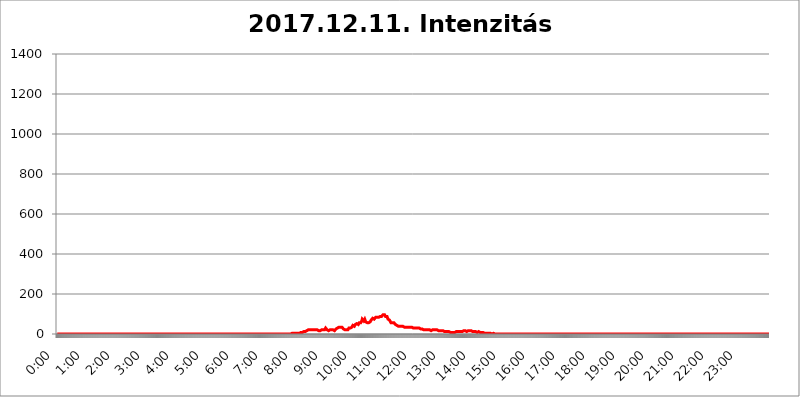
| Category | 2017.12.11. Intenzitás [W/m^2] |
|---|---|
| 0.0 | 0 |
| 0.0006944444444444445 | 0 |
| 0.001388888888888889 | 0 |
| 0.0020833333333333333 | 0 |
| 0.002777777777777778 | 0 |
| 0.003472222222222222 | 0 |
| 0.004166666666666667 | 0 |
| 0.004861111111111111 | 0 |
| 0.005555555555555556 | 0 |
| 0.0062499999999999995 | 0 |
| 0.006944444444444444 | 0 |
| 0.007638888888888889 | 0 |
| 0.008333333333333333 | 0 |
| 0.009027777777777779 | 0 |
| 0.009722222222222222 | 0 |
| 0.010416666666666666 | 0 |
| 0.011111111111111112 | 0 |
| 0.011805555555555555 | 0 |
| 0.012499999999999999 | 0 |
| 0.013194444444444444 | 0 |
| 0.013888888888888888 | 0 |
| 0.014583333333333332 | 0 |
| 0.015277777777777777 | 0 |
| 0.015972222222222224 | 0 |
| 0.016666666666666666 | 0 |
| 0.017361111111111112 | 0 |
| 0.018055555555555557 | 0 |
| 0.01875 | 0 |
| 0.019444444444444445 | 0 |
| 0.02013888888888889 | 0 |
| 0.020833333333333332 | 0 |
| 0.02152777777777778 | 0 |
| 0.022222222222222223 | 0 |
| 0.02291666666666667 | 0 |
| 0.02361111111111111 | 0 |
| 0.024305555555555556 | 0 |
| 0.024999999999999998 | 0 |
| 0.025694444444444447 | 0 |
| 0.02638888888888889 | 0 |
| 0.027083333333333334 | 0 |
| 0.027777777777777776 | 0 |
| 0.02847222222222222 | 0 |
| 0.029166666666666664 | 0 |
| 0.029861111111111113 | 0 |
| 0.030555555555555555 | 0 |
| 0.03125 | 0 |
| 0.03194444444444445 | 0 |
| 0.03263888888888889 | 0 |
| 0.03333333333333333 | 0 |
| 0.034027777777777775 | 0 |
| 0.034722222222222224 | 0 |
| 0.035416666666666666 | 0 |
| 0.036111111111111115 | 0 |
| 0.03680555555555556 | 0 |
| 0.0375 | 0 |
| 0.03819444444444444 | 0 |
| 0.03888888888888889 | 0 |
| 0.03958333333333333 | 0 |
| 0.04027777777777778 | 0 |
| 0.04097222222222222 | 0 |
| 0.041666666666666664 | 0 |
| 0.042361111111111106 | 0 |
| 0.04305555555555556 | 0 |
| 0.043750000000000004 | 0 |
| 0.044444444444444446 | 0 |
| 0.04513888888888889 | 0 |
| 0.04583333333333334 | 0 |
| 0.04652777777777778 | 0 |
| 0.04722222222222222 | 0 |
| 0.04791666666666666 | 0 |
| 0.04861111111111111 | 0 |
| 0.049305555555555554 | 0 |
| 0.049999999999999996 | 0 |
| 0.05069444444444445 | 0 |
| 0.051388888888888894 | 0 |
| 0.052083333333333336 | 0 |
| 0.05277777777777778 | 0 |
| 0.05347222222222222 | 0 |
| 0.05416666666666667 | 0 |
| 0.05486111111111111 | 0 |
| 0.05555555555555555 | 0 |
| 0.05625 | 0 |
| 0.05694444444444444 | 0 |
| 0.057638888888888885 | 0 |
| 0.05833333333333333 | 0 |
| 0.05902777777777778 | 0 |
| 0.059722222222222225 | 0 |
| 0.06041666666666667 | 0 |
| 0.061111111111111116 | 0 |
| 0.06180555555555556 | 0 |
| 0.0625 | 0 |
| 0.06319444444444444 | 0 |
| 0.06388888888888888 | 0 |
| 0.06458333333333334 | 0 |
| 0.06527777777777778 | 0 |
| 0.06597222222222222 | 0 |
| 0.06666666666666667 | 0 |
| 0.06736111111111111 | 0 |
| 0.06805555555555555 | 0 |
| 0.06874999999999999 | 0 |
| 0.06944444444444443 | 0 |
| 0.07013888888888889 | 0 |
| 0.07083333333333333 | 0 |
| 0.07152777777777779 | 0 |
| 0.07222222222222223 | 0 |
| 0.07291666666666667 | 0 |
| 0.07361111111111111 | 0 |
| 0.07430555555555556 | 0 |
| 0.075 | 0 |
| 0.07569444444444444 | 0 |
| 0.0763888888888889 | 0 |
| 0.07708333333333334 | 0 |
| 0.07777777777777778 | 0 |
| 0.07847222222222222 | 0 |
| 0.07916666666666666 | 0 |
| 0.0798611111111111 | 0 |
| 0.08055555555555556 | 0 |
| 0.08125 | 0 |
| 0.08194444444444444 | 0 |
| 0.08263888888888889 | 0 |
| 0.08333333333333333 | 0 |
| 0.08402777777777777 | 0 |
| 0.08472222222222221 | 0 |
| 0.08541666666666665 | 0 |
| 0.08611111111111112 | 0 |
| 0.08680555555555557 | 0 |
| 0.08750000000000001 | 0 |
| 0.08819444444444445 | 0 |
| 0.08888888888888889 | 0 |
| 0.08958333333333333 | 0 |
| 0.09027777777777778 | 0 |
| 0.09097222222222222 | 0 |
| 0.09166666666666667 | 0 |
| 0.09236111111111112 | 0 |
| 0.09305555555555556 | 0 |
| 0.09375 | 0 |
| 0.09444444444444444 | 0 |
| 0.09513888888888888 | 0 |
| 0.09583333333333333 | 0 |
| 0.09652777777777777 | 0 |
| 0.09722222222222222 | 0 |
| 0.09791666666666667 | 0 |
| 0.09861111111111111 | 0 |
| 0.09930555555555555 | 0 |
| 0.09999999999999999 | 0 |
| 0.10069444444444443 | 0 |
| 0.1013888888888889 | 0 |
| 0.10208333333333335 | 0 |
| 0.10277777777777779 | 0 |
| 0.10347222222222223 | 0 |
| 0.10416666666666667 | 0 |
| 0.10486111111111111 | 0 |
| 0.10555555555555556 | 0 |
| 0.10625 | 0 |
| 0.10694444444444444 | 0 |
| 0.1076388888888889 | 0 |
| 0.10833333333333334 | 0 |
| 0.10902777777777778 | 0 |
| 0.10972222222222222 | 0 |
| 0.1111111111111111 | 0 |
| 0.11180555555555556 | 0 |
| 0.11180555555555556 | 0 |
| 0.1125 | 0 |
| 0.11319444444444444 | 0 |
| 0.11388888888888889 | 0 |
| 0.11458333333333333 | 0 |
| 0.11527777777777777 | 0 |
| 0.11597222222222221 | 0 |
| 0.11666666666666665 | 0 |
| 0.1173611111111111 | 0 |
| 0.11805555555555557 | 0 |
| 0.11944444444444445 | 0 |
| 0.12013888888888889 | 0 |
| 0.12083333333333333 | 0 |
| 0.12152777777777778 | 0 |
| 0.12222222222222223 | 0 |
| 0.12291666666666667 | 0 |
| 0.12291666666666667 | 0 |
| 0.12361111111111112 | 0 |
| 0.12430555555555556 | 0 |
| 0.125 | 0 |
| 0.12569444444444444 | 0 |
| 0.12638888888888888 | 0 |
| 0.12708333333333333 | 0 |
| 0.16875 | 0 |
| 0.12847222222222224 | 0 |
| 0.12916666666666668 | 0 |
| 0.12986111111111112 | 0 |
| 0.13055555555555556 | 0 |
| 0.13125 | 0 |
| 0.13194444444444445 | 0 |
| 0.1326388888888889 | 0 |
| 0.13333333333333333 | 0 |
| 0.13402777777777777 | 0 |
| 0.13402777777777777 | 0 |
| 0.13472222222222222 | 0 |
| 0.13541666666666666 | 0 |
| 0.1361111111111111 | 0 |
| 0.13749999999999998 | 0 |
| 0.13819444444444443 | 0 |
| 0.1388888888888889 | 0 |
| 0.13958333333333334 | 0 |
| 0.14027777777777778 | 0 |
| 0.14097222222222222 | 0 |
| 0.14166666666666666 | 0 |
| 0.1423611111111111 | 0 |
| 0.14305555555555557 | 0 |
| 0.14375000000000002 | 0 |
| 0.14444444444444446 | 0 |
| 0.1451388888888889 | 0 |
| 0.1451388888888889 | 0 |
| 0.14652777777777778 | 0 |
| 0.14722222222222223 | 0 |
| 0.14791666666666667 | 0 |
| 0.1486111111111111 | 0 |
| 0.14930555555555555 | 0 |
| 0.15 | 0 |
| 0.15069444444444444 | 0 |
| 0.15138888888888888 | 0 |
| 0.15208333333333332 | 0 |
| 0.15277777777777776 | 0 |
| 0.15347222222222223 | 0 |
| 0.15416666666666667 | 0 |
| 0.15486111111111112 | 0 |
| 0.15555555555555556 | 0 |
| 0.15625 | 0 |
| 0.15694444444444444 | 0 |
| 0.15763888888888888 | 0 |
| 0.15833333333333333 | 0 |
| 0.15902777777777777 | 0 |
| 0.15972222222222224 | 0 |
| 0.16041666666666668 | 0 |
| 0.16111111111111112 | 0 |
| 0.16180555555555556 | 0 |
| 0.1625 | 0 |
| 0.16319444444444445 | 0 |
| 0.1638888888888889 | 0 |
| 0.16458333333333333 | 0 |
| 0.16527777777777777 | 0 |
| 0.16597222222222222 | 0 |
| 0.16666666666666666 | 0 |
| 0.1673611111111111 | 0 |
| 0.16805555555555554 | 0 |
| 0.16874999999999998 | 0 |
| 0.16944444444444443 | 0 |
| 0.17013888888888887 | 0 |
| 0.1708333333333333 | 0 |
| 0.17152777777777775 | 0 |
| 0.17222222222222225 | 0 |
| 0.1729166666666667 | 0 |
| 0.17361111111111113 | 0 |
| 0.17430555555555557 | 0 |
| 0.17500000000000002 | 0 |
| 0.17569444444444446 | 0 |
| 0.1763888888888889 | 0 |
| 0.17708333333333334 | 0 |
| 0.17777777777777778 | 0 |
| 0.17847222222222223 | 0 |
| 0.17916666666666667 | 0 |
| 0.1798611111111111 | 0 |
| 0.18055555555555555 | 0 |
| 0.18125 | 0 |
| 0.18194444444444444 | 0 |
| 0.1826388888888889 | 0 |
| 0.18333333333333335 | 0 |
| 0.1840277777777778 | 0 |
| 0.18472222222222223 | 0 |
| 0.18541666666666667 | 0 |
| 0.18611111111111112 | 0 |
| 0.18680555555555556 | 0 |
| 0.1875 | 0 |
| 0.18819444444444444 | 0 |
| 0.18888888888888888 | 0 |
| 0.18958333333333333 | 0 |
| 0.19027777777777777 | 0 |
| 0.1909722222222222 | 0 |
| 0.19166666666666665 | 0 |
| 0.19236111111111112 | 0 |
| 0.19305555555555554 | 0 |
| 0.19375 | 0 |
| 0.19444444444444445 | 0 |
| 0.1951388888888889 | 0 |
| 0.19583333333333333 | 0 |
| 0.19652777777777777 | 0 |
| 0.19722222222222222 | 0 |
| 0.19791666666666666 | 0 |
| 0.1986111111111111 | 0 |
| 0.19930555555555554 | 0 |
| 0.19999999999999998 | 0 |
| 0.20069444444444443 | 0 |
| 0.20138888888888887 | 0 |
| 0.2020833333333333 | 0 |
| 0.2027777777777778 | 0 |
| 0.2034722222222222 | 0 |
| 0.2041666666666667 | 0 |
| 0.20486111111111113 | 0 |
| 0.20555555555555557 | 0 |
| 0.20625000000000002 | 0 |
| 0.20694444444444446 | 0 |
| 0.2076388888888889 | 0 |
| 0.20833333333333334 | 0 |
| 0.20902777777777778 | 0 |
| 0.20972222222222223 | 0 |
| 0.21041666666666667 | 0 |
| 0.2111111111111111 | 0 |
| 0.21180555555555555 | 0 |
| 0.2125 | 0 |
| 0.21319444444444444 | 0 |
| 0.2138888888888889 | 0 |
| 0.21458333333333335 | 0 |
| 0.2152777777777778 | 0 |
| 0.21597222222222223 | 0 |
| 0.21666666666666667 | 0 |
| 0.21736111111111112 | 0 |
| 0.21805555555555556 | 0 |
| 0.21875 | 0 |
| 0.21944444444444444 | 0 |
| 0.22013888888888888 | 0 |
| 0.22083333333333333 | 0 |
| 0.22152777777777777 | 0 |
| 0.2222222222222222 | 0 |
| 0.22291666666666665 | 0 |
| 0.2236111111111111 | 0 |
| 0.22430555555555556 | 0 |
| 0.225 | 0 |
| 0.22569444444444445 | 0 |
| 0.2263888888888889 | 0 |
| 0.22708333333333333 | 0 |
| 0.22777777777777777 | 0 |
| 0.22847222222222222 | 0 |
| 0.22916666666666666 | 0 |
| 0.2298611111111111 | 0 |
| 0.23055555555555554 | 0 |
| 0.23124999999999998 | 0 |
| 0.23194444444444443 | 0 |
| 0.23263888888888887 | 0 |
| 0.2333333333333333 | 0 |
| 0.2340277777777778 | 0 |
| 0.2347222222222222 | 0 |
| 0.2354166666666667 | 0 |
| 0.23611111111111113 | 0 |
| 0.23680555555555557 | 0 |
| 0.23750000000000002 | 0 |
| 0.23819444444444446 | 0 |
| 0.2388888888888889 | 0 |
| 0.23958333333333334 | 0 |
| 0.24027777777777778 | 0 |
| 0.24097222222222223 | 0 |
| 0.24166666666666667 | 0 |
| 0.2423611111111111 | 0 |
| 0.24305555555555555 | 0 |
| 0.24375 | 0 |
| 0.24444444444444446 | 0 |
| 0.24513888888888888 | 0 |
| 0.24583333333333335 | 0 |
| 0.2465277777777778 | 0 |
| 0.24722222222222223 | 0 |
| 0.24791666666666667 | 0 |
| 0.24861111111111112 | 0 |
| 0.24930555555555556 | 0 |
| 0.25 | 0 |
| 0.25069444444444444 | 0 |
| 0.2513888888888889 | 0 |
| 0.2520833333333333 | 0 |
| 0.25277777777777777 | 0 |
| 0.2534722222222222 | 0 |
| 0.25416666666666665 | 0 |
| 0.2548611111111111 | 0 |
| 0.2555555555555556 | 0 |
| 0.25625000000000003 | 0 |
| 0.2569444444444445 | 0 |
| 0.2576388888888889 | 0 |
| 0.25833333333333336 | 0 |
| 0.2590277777777778 | 0 |
| 0.25972222222222224 | 0 |
| 0.2604166666666667 | 0 |
| 0.2611111111111111 | 0 |
| 0.26180555555555557 | 0 |
| 0.2625 | 0 |
| 0.26319444444444445 | 0 |
| 0.2638888888888889 | 0 |
| 0.26458333333333334 | 0 |
| 0.2652777777777778 | 0 |
| 0.2659722222222222 | 0 |
| 0.26666666666666666 | 0 |
| 0.2673611111111111 | 0 |
| 0.26805555555555555 | 0 |
| 0.26875 | 0 |
| 0.26944444444444443 | 0 |
| 0.2701388888888889 | 0 |
| 0.2708333333333333 | 0 |
| 0.27152777777777776 | 0 |
| 0.2722222222222222 | 0 |
| 0.27291666666666664 | 0 |
| 0.2736111111111111 | 0 |
| 0.2743055555555555 | 0 |
| 0.27499999999999997 | 0 |
| 0.27569444444444446 | 0 |
| 0.27638888888888885 | 0 |
| 0.27708333333333335 | 0 |
| 0.2777777777777778 | 0 |
| 0.27847222222222223 | 0 |
| 0.2791666666666667 | 0 |
| 0.2798611111111111 | 0 |
| 0.28055555555555556 | 0 |
| 0.28125 | 0 |
| 0.28194444444444444 | 0 |
| 0.2826388888888889 | 0 |
| 0.2833333333333333 | 0 |
| 0.28402777777777777 | 0 |
| 0.2847222222222222 | 0 |
| 0.28541666666666665 | 0 |
| 0.28611111111111115 | 0 |
| 0.28680555555555554 | 0 |
| 0.28750000000000003 | 0 |
| 0.2881944444444445 | 0 |
| 0.2888888888888889 | 0 |
| 0.28958333333333336 | 0 |
| 0.2902777777777778 | 0 |
| 0.29097222222222224 | 0 |
| 0.2916666666666667 | 0 |
| 0.2923611111111111 | 0 |
| 0.29305555555555557 | 0 |
| 0.29375 | 0 |
| 0.29444444444444445 | 0 |
| 0.2951388888888889 | 0 |
| 0.29583333333333334 | 0 |
| 0.2965277777777778 | 0 |
| 0.2972222222222222 | 0 |
| 0.29791666666666666 | 0 |
| 0.2986111111111111 | 0 |
| 0.29930555555555555 | 0 |
| 0.3 | 0 |
| 0.30069444444444443 | 0 |
| 0.3013888888888889 | 0 |
| 0.3020833333333333 | 0 |
| 0.30277777777777776 | 0 |
| 0.3034722222222222 | 0 |
| 0.30416666666666664 | 0 |
| 0.3048611111111111 | 0 |
| 0.3055555555555555 | 0 |
| 0.30624999999999997 | 0 |
| 0.3069444444444444 | 0 |
| 0.3076388888888889 | 0 |
| 0.30833333333333335 | 0 |
| 0.3090277777777778 | 0 |
| 0.30972222222222223 | 0 |
| 0.3104166666666667 | 0 |
| 0.3111111111111111 | 0 |
| 0.31180555555555556 | 0 |
| 0.3125 | 0 |
| 0.31319444444444444 | 0 |
| 0.3138888888888889 | 0 |
| 0.3145833333333333 | 0 |
| 0.31527777777777777 | 0 |
| 0.3159722222222222 | 0 |
| 0.31666666666666665 | 0 |
| 0.31736111111111115 | 0 |
| 0.31805555555555554 | 0 |
| 0.31875000000000003 | 0 |
| 0.3194444444444445 | 0 |
| 0.3201388888888889 | 0 |
| 0.32083333333333336 | 0 |
| 0.3215277777777778 | 0 |
| 0.32222222222222224 | 0 |
| 0.3229166666666667 | 0 |
| 0.3236111111111111 | 0 |
| 0.32430555555555557 | 0 |
| 0.325 | 0 |
| 0.32569444444444445 | 3.525 |
| 0.3263888888888889 | 3.525 |
| 0.32708333333333334 | 0 |
| 0.3277777777777778 | 0 |
| 0.3284722222222222 | 3.525 |
| 0.32916666666666666 | 3.525 |
| 0.3298611111111111 | 3.525 |
| 0.33055555555555555 | 3.525 |
| 0.33125 | 3.525 |
| 0.33194444444444443 | 3.525 |
| 0.3326388888888889 | 3.525 |
| 0.3333333333333333 | 3.525 |
| 0.3340277777777778 | 3.525 |
| 0.3347222222222222 | 3.525 |
| 0.3354166666666667 | 3.525 |
| 0.3361111111111111 | 3.525 |
| 0.3368055555555556 | 3.525 |
| 0.33749999999999997 | 3.525 |
| 0.33819444444444446 | 3.525 |
| 0.33888888888888885 | 3.525 |
| 0.33958333333333335 | 3.525 |
| 0.34027777777777773 | 7.887 |
| 0.34097222222222223 | 7.887 |
| 0.3416666666666666 | 7.887 |
| 0.3423611111111111 | 7.887 |
| 0.3430555555555555 | 7.887 |
| 0.34375 | 7.887 |
| 0.3444444444444445 | 7.887 |
| 0.3451388888888889 | 7.887 |
| 0.3458333333333334 | 12.257 |
| 0.34652777777777777 | 12.257 |
| 0.34722222222222227 | 12.257 |
| 0.34791666666666665 | 12.257 |
| 0.34861111111111115 | 12.257 |
| 0.34930555555555554 | 12.257 |
| 0.35000000000000003 | 16.636 |
| 0.3506944444444444 | 16.636 |
| 0.3513888888888889 | 21.024 |
| 0.3520833333333333 | 21.024 |
| 0.3527777777777778 | 21.024 |
| 0.3534722222222222 | 21.024 |
| 0.3541666666666667 | 21.024 |
| 0.3548611111111111 | 21.024 |
| 0.35555555555555557 | 21.024 |
| 0.35625 | 21.024 |
| 0.35694444444444445 | 21.024 |
| 0.3576388888888889 | 25.419 |
| 0.35833333333333334 | 21.024 |
| 0.3590277777777778 | 21.024 |
| 0.3597222222222222 | 21.024 |
| 0.36041666666666666 | 21.024 |
| 0.3611111111111111 | 21.024 |
| 0.36180555555555555 | 21.024 |
| 0.3625 | 21.024 |
| 0.36319444444444443 | 21.024 |
| 0.3638888888888889 | 21.024 |
| 0.3645833333333333 | 21.024 |
| 0.3652777777777778 | 21.024 |
| 0.3659722222222222 | 16.636 |
| 0.3666666666666667 | 16.636 |
| 0.3673611111111111 | 21.024 |
| 0.3680555555555556 | 16.636 |
| 0.36874999999999997 | 16.636 |
| 0.36944444444444446 | 16.636 |
| 0.37013888888888885 | 21.024 |
| 0.37083333333333335 | 21.024 |
| 0.37152777777777773 | 21.024 |
| 0.37222222222222223 | 21.024 |
| 0.3729166666666666 | 21.024 |
| 0.3736111111111111 | 21.024 |
| 0.3743055555555555 | 21.024 |
| 0.375 | 21.024 |
| 0.3756944444444445 | 25.419 |
| 0.3763888888888889 | 29.823 |
| 0.3770833333333334 | 29.823 |
| 0.37777777777777777 | 25.419 |
| 0.37847222222222227 | 21.024 |
| 0.37916666666666665 | 21.024 |
| 0.37986111111111115 | 16.636 |
| 0.38055555555555554 | 16.636 |
| 0.38125000000000003 | 21.024 |
| 0.3819444444444444 | 21.024 |
| 0.3826388888888889 | 21.024 |
| 0.3833333333333333 | 21.024 |
| 0.3840277777777778 | 21.024 |
| 0.3847222222222222 | 21.024 |
| 0.3854166666666667 | 21.024 |
| 0.3861111111111111 | 21.024 |
| 0.38680555555555557 | 21.024 |
| 0.3875 | 25.419 |
| 0.38819444444444445 | 21.024 |
| 0.3888888888888889 | 16.636 |
| 0.38958333333333334 | 21.024 |
| 0.3902777777777778 | 21.024 |
| 0.3909722222222222 | 25.419 |
| 0.39166666666666666 | 25.419 |
| 0.3923611111111111 | 29.823 |
| 0.39305555555555555 | 29.823 |
| 0.39375 | 34.234 |
| 0.39444444444444443 | 34.234 |
| 0.3951388888888889 | 34.234 |
| 0.3958333333333333 | 38.653 |
| 0.3965277777777778 | 38.653 |
| 0.3972222222222222 | 34.234 |
| 0.3979166666666667 | 34.234 |
| 0.3986111111111111 | 34.234 |
| 0.3993055555555556 | 34.234 |
| 0.39999999999999997 | 29.823 |
| 0.40069444444444446 | 29.823 |
| 0.40138888888888885 | 25.419 |
| 0.40208333333333335 | 25.419 |
| 0.40277777777777773 | 21.024 |
| 0.40347222222222223 | 21.024 |
| 0.4041666666666666 | 21.024 |
| 0.4048611111111111 | 21.024 |
| 0.4055555555555555 | 21.024 |
| 0.40625 | 21.024 |
| 0.4069444444444445 | 21.024 |
| 0.4076388888888889 | 21.024 |
| 0.4083333333333334 | 25.419 |
| 0.40902777777777777 | 29.823 |
| 0.40972222222222227 | 29.823 |
| 0.41041666666666665 | 34.234 |
| 0.41111111111111115 | 29.823 |
| 0.41180555555555554 | 29.823 |
| 0.41250000000000003 | 29.823 |
| 0.4131944444444444 | 34.234 |
| 0.4138888888888889 | 38.653 |
| 0.4145833333333333 | 43.079 |
| 0.4152777777777778 | 38.653 |
| 0.4159722222222222 | 38.653 |
| 0.4166666666666667 | 38.653 |
| 0.4173611111111111 | 43.079 |
| 0.41805555555555557 | 47.511 |
| 0.41875 | 51.951 |
| 0.41944444444444445 | 51.951 |
| 0.4201388888888889 | 51.951 |
| 0.42083333333333334 | 47.511 |
| 0.4215277777777778 | 47.511 |
| 0.4222222222222222 | 47.511 |
| 0.42291666666666666 | 51.951 |
| 0.4236111111111111 | 56.398 |
| 0.42430555555555555 | 56.398 |
| 0.425 | 56.398 |
| 0.42569444444444443 | 56.398 |
| 0.4263888888888889 | 60.85 |
| 0.4270833333333333 | 65.31 |
| 0.4277777777777778 | 74.246 |
| 0.4284722222222222 | 74.246 |
| 0.4291666666666667 | 69.775 |
| 0.4298611111111111 | 65.31 |
| 0.4305555555555556 | 69.775 |
| 0.43124999999999997 | 74.246 |
| 0.43194444444444446 | 69.775 |
| 0.43263888888888885 | 60.85 |
| 0.43333333333333335 | 56.398 |
| 0.43402777777777773 | 56.398 |
| 0.43472222222222223 | 56.398 |
| 0.4354166666666666 | 51.951 |
| 0.4361111111111111 | 51.951 |
| 0.4368055555555555 | 56.398 |
| 0.4375 | 56.398 |
| 0.4381944444444445 | 56.398 |
| 0.4388888888888889 | 60.85 |
| 0.4395833333333334 | 65.31 |
| 0.44027777777777777 | 69.775 |
| 0.44097222222222227 | 74.246 |
| 0.44166666666666665 | 74.246 |
| 0.44236111111111115 | 78.722 |
| 0.44305555555555554 | 74.246 |
| 0.44375000000000003 | 74.246 |
| 0.4444444444444444 | 74.246 |
| 0.4451388888888889 | 74.246 |
| 0.4458333333333333 | 78.722 |
| 0.4465277777777778 | 83.205 |
| 0.4472222222222222 | 83.205 |
| 0.4479166666666667 | 83.205 |
| 0.4486111111111111 | 83.205 |
| 0.44930555555555557 | 83.205 |
| 0.45 | 83.205 |
| 0.45069444444444445 | 83.205 |
| 0.4513888888888889 | 87.692 |
| 0.45208333333333334 | 83.205 |
| 0.4527777777777778 | 87.692 |
| 0.4534722222222222 | 92.184 |
| 0.45416666666666666 | 92.184 |
| 0.4548611111111111 | 87.692 |
| 0.45555555555555555 | 92.184 |
| 0.45625 | 92.184 |
| 0.45694444444444443 | 96.682 |
| 0.4576388888888889 | 96.682 |
| 0.4583333333333333 | 96.682 |
| 0.4590277777777778 | 96.682 |
| 0.4597222222222222 | 96.682 |
| 0.4604166666666667 | 87.692 |
| 0.4611111111111111 | 83.205 |
| 0.4618055555555556 | 83.205 |
| 0.46249999999999997 | 87.692 |
| 0.46319444444444446 | 87.692 |
| 0.46388888888888885 | 74.246 |
| 0.46458333333333335 | 69.775 |
| 0.46527777777777773 | 74.246 |
| 0.46597222222222223 | 69.775 |
| 0.4666666666666666 | 65.31 |
| 0.4673611111111111 | 65.31 |
| 0.4680555555555555 | 56.398 |
| 0.46875 | 56.398 |
| 0.4694444444444445 | 56.398 |
| 0.4701388888888889 | 56.398 |
| 0.4708333333333334 | 56.398 |
| 0.47152777777777777 | 56.398 |
| 0.47222222222222227 | 56.398 |
| 0.47291666666666665 | 56.398 |
| 0.47361111111111115 | 51.951 |
| 0.47430555555555554 | 47.511 |
| 0.47500000000000003 | 47.511 |
| 0.4756944444444444 | 47.511 |
| 0.4763888888888889 | 43.079 |
| 0.4770833333333333 | 38.653 |
| 0.4777777777777778 | 38.653 |
| 0.4784722222222222 | 38.653 |
| 0.4791666666666667 | 38.653 |
| 0.4798611111111111 | 38.653 |
| 0.48055555555555557 | 38.653 |
| 0.48125 | 38.653 |
| 0.48194444444444445 | 38.653 |
| 0.4826388888888889 | 38.653 |
| 0.48333333333333334 | 38.653 |
| 0.4840277777777778 | 38.653 |
| 0.4847222222222222 | 38.653 |
| 0.48541666666666666 | 34.234 |
| 0.4861111111111111 | 34.234 |
| 0.48680555555555555 | 34.234 |
| 0.4875 | 34.234 |
| 0.48819444444444443 | 34.234 |
| 0.4888888888888889 | 34.234 |
| 0.4895833333333333 | 34.234 |
| 0.4902777777777778 | 34.234 |
| 0.4909722222222222 | 34.234 |
| 0.4916666666666667 | 34.234 |
| 0.4923611111111111 | 34.234 |
| 0.4930555555555556 | 34.234 |
| 0.49374999999999997 | 34.234 |
| 0.49444444444444446 | 34.234 |
| 0.49513888888888885 | 34.234 |
| 0.49583333333333335 | 34.234 |
| 0.49652777777777773 | 34.234 |
| 0.49722222222222223 | 34.234 |
| 0.4979166666666666 | 34.234 |
| 0.4986111111111111 | 29.823 |
| 0.4993055555555555 | 29.823 |
| 0.5 | 29.823 |
| 0.5006944444444444 | 29.823 |
| 0.5013888888888889 | 29.823 |
| 0.5020833333333333 | 29.823 |
| 0.5027777777777778 | 29.823 |
| 0.5034722222222222 | 29.823 |
| 0.5041666666666667 | 29.823 |
| 0.5048611111111111 | 29.823 |
| 0.5055555555555555 | 29.823 |
| 0.50625 | 25.419 |
| 0.5069444444444444 | 29.823 |
| 0.5076388888888889 | 29.823 |
| 0.5083333333333333 | 25.419 |
| 0.5090277777777777 | 29.823 |
| 0.5097222222222222 | 25.419 |
| 0.5104166666666666 | 25.419 |
| 0.5111111111111112 | 25.419 |
| 0.5118055555555555 | 25.419 |
| 0.5125000000000001 | 25.419 |
| 0.5131944444444444 | 25.419 |
| 0.513888888888889 | 21.024 |
| 0.5145833333333333 | 25.419 |
| 0.5152777777777778 | 21.024 |
| 0.5159722222222222 | 21.024 |
| 0.5166666666666667 | 21.024 |
| 0.517361111111111 | 21.024 |
| 0.5180555555555556 | 21.024 |
| 0.5187499999999999 | 21.024 |
| 0.5194444444444445 | 21.024 |
| 0.5201388888888888 | 21.024 |
| 0.5208333333333334 | 21.024 |
| 0.5215277777777778 | 21.024 |
| 0.5222222222222223 | 21.024 |
| 0.5229166666666667 | 21.024 |
| 0.5236111111111111 | 21.024 |
| 0.5243055555555556 | 16.636 |
| 0.525 | 16.636 |
| 0.5256944444444445 | 16.636 |
| 0.5263888888888889 | 21.024 |
| 0.5270833333333333 | 21.024 |
| 0.5277777777777778 | 21.024 |
| 0.5284722222222222 | 21.024 |
| 0.5291666666666667 | 21.024 |
| 0.5298611111111111 | 21.024 |
| 0.5305555555555556 | 21.024 |
| 0.53125 | 21.024 |
| 0.5319444444444444 | 21.024 |
| 0.5326388888888889 | 21.024 |
| 0.5333333333333333 | 21.024 |
| 0.5340277777777778 | 21.024 |
| 0.5347222222222222 | 16.636 |
| 0.5354166666666667 | 16.636 |
| 0.5361111111111111 | 16.636 |
| 0.5368055555555555 | 16.636 |
| 0.5375 | 16.636 |
| 0.5381944444444444 | 16.636 |
| 0.5388888888888889 | 16.636 |
| 0.5395833333333333 | 16.636 |
| 0.5402777777777777 | 16.636 |
| 0.5409722222222222 | 16.636 |
| 0.5416666666666666 | 16.636 |
| 0.5423611111111112 | 16.636 |
| 0.5430555555555555 | 12.257 |
| 0.5437500000000001 | 12.257 |
| 0.5444444444444444 | 12.257 |
| 0.545138888888889 | 12.257 |
| 0.5458333333333333 | 12.257 |
| 0.5465277777777778 | 12.257 |
| 0.5472222222222222 | 12.257 |
| 0.5479166666666667 | 12.257 |
| 0.548611111111111 | 12.257 |
| 0.5493055555555556 | 12.257 |
| 0.5499999999999999 | 12.257 |
| 0.5506944444444445 | 7.887 |
| 0.5513888888888888 | 7.887 |
| 0.5520833333333334 | 7.887 |
| 0.5527777777777778 | 7.887 |
| 0.5534722222222223 | 7.887 |
| 0.5541666666666667 | 7.887 |
| 0.5548611111111111 | 7.887 |
| 0.5555555555555556 | 7.887 |
| 0.55625 | 7.887 |
| 0.5569444444444445 | 7.887 |
| 0.5576388888888889 | 7.887 |
| 0.5583333333333333 | 7.887 |
| 0.5590277777777778 | 12.257 |
| 0.5597222222222222 | 12.257 |
| 0.5604166666666667 | 12.257 |
| 0.5611111111111111 | 12.257 |
| 0.5618055555555556 | 12.257 |
| 0.5625 | 12.257 |
| 0.5631944444444444 | 12.257 |
| 0.5638888888888889 | 12.257 |
| 0.5645833333333333 | 12.257 |
| 0.5652777777777778 | 12.257 |
| 0.5659722222222222 | 12.257 |
| 0.5666666666666667 | 12.257 |
| 0.5673611111111111 | 12.257 |
| 0.5680555555555555 | 12.257 |
| 0.56875 | 16.636 |
| 0.5694444444444444 | 16.636 |
| 0.5701388888888889 | 16.636 |
| 0.5708333333333333 | 16.636 |
| 0.5715277777777777 | 12.257 |
| 0.5722222222222222 | 16.636 |
| 0.5729166666666666 | 16.636 |
| 0.5736111111111112 | 12.257 |
| 0.5743055555555555 | 12.257 |
| 0.5750000000000001 | 16.636 |
| 0.5756944444444444 | 16.636 |
| 0.576388888888889 | 16.636 |
| 0.5770833333333333 | 16.636 |
| 0.5777777777777778 | 16.636 |
| 0.5784722222222222 | 16.636 |
| 0.5791666666666667 | 16.636 |
| 0.579861111111111 | 16.636 |
| 0.5805555555555556 | 16.636 |
| 0.5812499999999999 | 12.257 |
| 0.5819444444444445 | 12.257 |
| 0.5826388888888888 | 12.257 |
| 0.5833333333333334 | 12.257 |
| 0.5840277777777778 | 12.257 |
| 0.5847222222222223 | 12.257 |
| 0.5854166666666667 | 12.257 |
| 0.5861111111111111 | 12.257 |
| 0.5868055555555556 | 12.257 |
| 0.5875 | 7.887 |
| 0.5881944444444445 | 12.257 |
| 0.5888888888888889 | 7.887 |
| 0.5895833333333333 | 7.887 |
| 0.5902777777777778 | 7.887 |
| 0.5909722222222222 | 12.257 |
| 0.5916666666666667 | 7.887 |
| 0.5923611111111111 | 7.887 |
| 0.5930555555555556 | 7.887 |
| 0.59375 | 7.887 |
| 0.5944444444444444 | 7.887 |
| 0.5951388888888889 | 7.887 |
| 0.5958333333333333 | 7.887 |
| 0.5965277777777778 | 7.887 |
| 0.5972222222222222 | 7.887 |
| 0.5979166666666667 | 7.887 |
| 0.5986111111111111 | 7.887 |
| 0.5993055555555555 | 3.525 |
| 0.6 | 3.525 |
| 0.6006944444444444 | 3.525 |
| 0.6013888888888889 | 3.525 |
| 0.6020833333333333 | 3.525 |
| 0.6027777777777777 | 3.525 |
| 0.6034722222222222 | 3.525 |
| 0.6041666666666666 | 3.525 |
| 0.6048611111111112 | 3.525 |
| 0.6055555555555555 | 3.525 |
| 0.6062500000000001 | 3.525 |
| 0.6069444444444444 | 3.525 |
| 0.607638888888889 | 3.525 |
| 0.6083333333333333 | 3.525 |
| 0.6090277777777778 | 3.525 |
| 0.6097222222222222 | 0 |
| 0.6104166666666667 | 0 |
| 0.611111111111111 | 3.525 |
| 0.6118055555555556 | 3.525 |
| 0.6124999999999999 | 0 |
| 0.6131944444444445 | 0 |
| 0.6138888888888888 | 0 |
| 0.6145833333333334 | 3.525 |
| 0.6152777777777778 | 0 |
| 0.6159722222222223 | 0 |
| 0.6166666666666667 | 0 |
| 0.6173611111111111 | 0 |
| 0.6180555555555556 | 0 |
| 0.61875 | 0 |
| 0.6194444444444445 | 0 |
| 0.6201388888888889 | 0 |
| 0.6208333333333333 | 0 |
| 0.6215277777777778 | 0 |
| 0.6222222222222222 | 0 |
| 0.6229166666666667 | 0 |
| 0.6236111111111111 | 0 |
| 0.6243055555555556 | 0 |
| 0.625 | 0 |
| 0.6256944444444444 | 0 |
| 0.6263888888888889 | 0 |
| 0.6270833333333333 | 0 |
| 0.6277777777777778 | 0 |
| 0.6284722222222222 | 0 |
| 0.6291666666666667 | 0 |
| 0.6298611111111111 | 0 |
| 0.6305555555555555 | 0 |
| 0.63125 | 0 |
| 0.6319444444444444 | 0 |
| 0.6326388888888889 | 0 |
| 0.6333333333333333 | 0 |
| 0.6340277777777777 | 0 |
| 0.6347222222222222 | 0 |
| 0.6354166666666666 | 0 |
| 0.6361111111111112 | 0 |
| 0.6368055555555555 | 0 |
| 0.6375000000000001 | 0 |
| 0.6381944444444444 | 0 |
| 0.638888888888889 | 0 |
| 0.6395833333333333 | 0 |
| 0.6402777777777778 | 0 |
| 0.6409722222222222 | 0 |
| 0.6416666666666667 | 0 |
| 0.642361111111111 | 0 |
| 0.6430555555555556 | 0 |
| 0.6437499999999999 | 0 |
| 0.6444444444444445 | 0 |
| 0.6451388888888888 | 0 |
| 0.6458333333333334 | 0 |
| 0.6465277777777778 | 0 |
| 0.6472222222222223 | 0 |
| 0.6479166666666667 | 0 |
| 0.6486111111111111 | 0 |
| 0.6493055555555556 | 0 |
| 0.65 | 0 |
| 0.6506944444444445 | 0 |
| 0.6513888888888889 | 0 |
| 0.6520833333333333 | 0 |
| 0.6527777777777778 | 0 |
| 0.6534722222222222 | 0 |
| 0.6541666666666667 | 0 |
| 0.6548611111111111 | 0 |
| 0.6555555555555556 | 0 |
| 0.65625 | 0 |
| 0.6569444444444444 | 0 |
| 0.6576388888888889 | 0 |
| 0.6583333333333333 | 0 |
| 0.6590277777777778 | 0 |
| 0.6597222222222222 | 0 |
| 0.6604166666666667 | 0 |
| 0.6611111111111111 | 0 |
| 0.6618055555555555 | 0 |
| 0.6625 | 0 |
| 0.6631944444444444 | 0 |
| 0.6638888888888889 | 0 |
| 0.6645833333333333 | 0 |
| 0.6652777777777777 | 0 |
| 0.6659722222222222 | 0 |
| 0.6666666666666666 | 0 |
| 0.6673611111111111 | 0 |
| 0.6680555555555556 | 0 |
| 0.6687500000000001 | 0 |
| 0.6694444444444444 | 0 |
| 0.6701388888888888 | 0 |
| 0.6708333333333334 | 0 |
| 0.6715277777777778 | 0 |
| 0.6722222222222222 | 0 |
| 0.6729166666666666 | 0 |
| 0.6736111111111112 | 0 |
| 0.6743055555555556 | 0 |
| 0.6749999999999999 | 0 |
| 0.6756944444444444 | 0 |
| 0.6763888888888889 | 0 |
| 0.6770833333333334 | 0 |
| 0.6777777777777777 | 0 |
| 0.6784722222222223 | 0 |
| 0.6791666666666667 | 0 |
| 0.6798611111111111 | 0 |
| 0.6805555555555555 | 0 |
| 0.68125 | 0 |
| 0.6819444444444445 | 0 |
| 0.6826388888888889 | 0 |
| 0.6833333333333332 | 0 |
| 0.6840277777777778 | 0 |
| 0.6847222222222222 | 0 |
| 0.6854166666666667 | 0 |
| 0.686111111111111 | 0 |
| 0.6868055555555556 | 0 |
| 0.6875 | 0 |
| 0.6881944444444444 | 0 |
| 0.688888888888889 | 0 |
| 0.6895833333333333 | 0 |
| 0.6902777777777778 | 0 |
| 0.6909722222222222 | 0 |
| 0.6916666666666668 | 0 |
| 0.6923611111111111 | 0 |
| 0.6930555555555555 | 0 |
| 0.69375 | 0 |
| 0.6944444444444445 | 0 |
| 0.6951388888888889 | 0 |
| 0.6958333333333333 | 0 |
| 0.6965277777777777 | 0 |
| 0.6972222222222223 | 0 |
| 0.6979166666666666 | 0 |
| 0.6986111111111111 | 0 |
| 0.6993055555555556 | 0 |
| 0.7000000000000001 | 0 |
| 0.7006944444444444 | 0 |
| 0.7013888888888888 | 0 |
| 0.7020833333333334 | 0 |
| 0.7027777777777778 | 0 |
| 0.7034722222222222 | 0 |
| 0.7041666666666666 | 0 |
| 0.7048611111111112 | 0 |
| 0.7055555555555556 | 0 |
| 0.7062499999999999 | 0 |
| 0.7069444444444444 | 0 |
| 0.7076388888888889 | 0 |
| 0.7083333333333334 | 0 |
| 0.7090277777777777 | 0 |
| 0.7097222222222223 | 0 |
| 0.7104166666666667 | 0 |
| 0.7111111111111111 | 0 |
| 0.7118055555555555 | 0 |
| 0.7125 | 0 |
| 0.7131944444444445 | 0 |
| 0.7138888888888889 | 0 |
| 0.7145833333333332 | 0 |
| 0.7152777777777778 | 0 |
| 0.7159722222222222 | 0 |
| 0.7166666666666667 | 0 |
| 0.717361111111111 | 0 |
| 0.7180555555555556 | 0 |
| 0.71875 | 0 |
| 0.7194444444444444 | 0 |
| 0.720138888888889 | 0 |
| 0.7208333333333333 | 0 |
| 0.7215277777777778 | 0 |
| 0.7222222222222222 | 0 |
| 0.7229166666666668 | 0 |
| 0.7236111111111111 | 0 |
| 0.7243055555555555 | 0 |
| 0.725 | 0 |
| 0.7256944444444445 | 0 |
| 0.7263888888888889 | 0 |
| 0.7270833333333333 | 0 |
| 0.7277777777777777 | 0 |
| 0.7284722222222223 | 0 |
| 0.7291666666666666 | 0 |
| 0.7298611111111111 | 0 |
| 0.7305555555555556 | 0 |
| 0.7312500000000001 | 0 |
| 0.7319444444444444 | 0 |
| 0.7326388888888888 | 0 |
| 0.7333333333333334 | 0 |
| 0.7340277777777778 | 0 |
| 0.7347222222222222 | 0 |
| 0.7354166666666666 | 0 |
| 0.7361111111111112 | 0 |
| 0.7368055555555556 | 0 |
| 0.7374999999999999 | 0 |
| 0.7381944444444444 | 0 |
| 0.7388888888888889 | 0 |
| 0.7395833333333334 | 0 |
| 0.7402777777777777 | 0 |
| 0.7409722222222223 | 0 |
| 0.7416666666666667 | 0 |
| 0.7423611111111111 | 0 |
| 0.7430555555555555 | 0 |
| 0.74375 | 0 |
| 0.7444444444444445 | 0 |
| 0.7451388888888889 | 0 |
| 0.7458333333333332 | 0 |
| 0.7465277777777778 | 0 |
| 0.7472222222222222 | 0 |
| 0.7479166666666667 | 0 |
| 0.748611111111111 | 0 |
| 0.7493055555555556 | 0 |
| 0.75 | 0 |
| 0.7506944444444444 | 0 |
| 0.751388888888889 | 0 |
| 0.7520833333333333 | 0 |
| 0.7527777777777778 | 0 |
| 0.7534722222222222 | 0 |
| 0.7541666666666668 | 0 |
| 0.7548611111111111 | 0 |
| 0.7555555555555555 | 0 |
| 0.75625 | 0 |
| 0.7569444444444445 | 0 |
| 0.7576388888888889 | 0 |
| 0.7583333333333333 | 0 |
| 0.7590277777777777 | 0 |
| 0.7597222222222223 | 0 |
| 0.7604166666666666 | 0 |
| 0.7611111111111111 | 0 |
| 0.7618055555555556 | 0 |
| 0.7625000000000001 | 0 |
| 0.7631944444444444 | 0 |
| 0.7638888888888888 | 0 |
| 0.7645833333333334 | 0 |
| 0.7652777777777778 | 0 |
| 0.7659722222222222 | 0 |
| 0.7666666666666666 | 0 |
| 0.7673611111111112 | 0 |
| 0.7680555555555556 | 0 |
| 0.7687499999999999 | 0 |
| 0.7694444444444444 | 0 |
| 0.7701388888888889 | 0 |
| 0.7708333333333334 | 0 |
| 0.7715277777777777 | 0 |
| 0.7722222222222223 | 0 |
| 0.7729166666666667 | 0 |
| 0.7736111111111111 | 0 |
| 0.7743055555555555 | 0 |
| 0.775 | 0 |
| 0.7756944444444445 | 0 |
| 0.7763888888888889 | 0 |
| 0.7770833333333332 | 0 |
| 0.7777777777777778 | 0 |
| 0.7784722222222222 | 0 |
| 0.7791666666666667 | 0 |
| 0.779861111111111 | 0 |
| 0.7805555555555556 | 0 |
| 0.78125 | 0 |
| 0.7819444444444444 | 0 |
| 0.782638888888889 | 0 |
| 0.7833333333333333 | 0 |
| 0.7840277777777778 | 0 |
| 0.7847222222222222 | 0 |
| 0.7854166666666668 | 0 |
| 0.7861111111111111 | 0 |
| 0.7868055555555555 | 0 |
| 0.7875 | 0 |
| 0.7881944444444445 | 0 |
| 0.7888888888888889 | 0 |
| 0.7895833333333333 | 0 |
| 0.7902777777777777 | 0 |
| 0.7909722222222223 | 0 |
| 0.7916666666666666 | 0 |
| 0.7923611111111111 | 0 |
| 0.7930555555555556 | 0 |
| 0.7937500000000001 | 0 |
| 0.7944444444444444 | 0 |
| 0.7951388888888888 | 0 |
| 0.7958333333333334 | 0 |
| 0.7965277777777778 | 0 |
| 0.7972222222222222 | 0 |
| 0.7979166666666666 | 0 |
| 0.7986111111111112 | 0 |
| 0.7993055555555556 | 0 |
| 0.7999999999999999 | 0 |
| 0.8006944444444444 | 0 |
| 0.8013888888888889 | 0 |
| 0.8020833333333334 | 0 |
| 0.8027777777777777 | 0 |
| 0.8034722222222223 | 0 |
| 0.8041666666666667 | 0 |
| 0.8048611111111111 | 0 |
| 0.8055555555555555 | 0 |
| 0.80625 | 0 |
| 0.8069444444444445 | 0 |
| 0.8076388888888889 | 0 |
| 0.8083333333333332 | 0 |
| 0.8090277777777778 | 0 |
| 0.8097222222222222 | 0 |
| 0.8104166666666667 | 0 |
| 0.811111111111111 | 0 |
| 0.8118055555555556 | 0 |
| 0.8125 | 0 |
| 0.8131944444444444 | 0 |
| 0.813888888888889 | 0 |
| 0.8145833333333333 | 0 |
| 0.8152777777777778 | 0 |
| 0.8159722222222222 | 0 |
| 0.8166666666666668 | 0 |
| 0.8173611111111111 | 0 |
| 0.8180555555555555 | 0 |
| 0.81875 | 0 |
| 0.8194444444444445 | 0 |
| 0.8201388888888889 | 0 |
| 0.8208333333333333 | 0 |
| 0.8215277777777777 | 0 |
| 0.8222222222222223 | 0 |
| 0.8229166666666666 | 0 |
| 0.8236111111111111 | 0 |
| 0.8243055555555556 | 0 |
| 0.8250000000000001 | 0 |
| 0.8256944444444444 | 0 |
| 0.8263888888888888 | 0 |
| 0.8270833333333334 | 0 |
| 0.8277777777777778 | 0 |
| 0.8284722222222222 | 0 |
| 0.8291666666666666 | 0 |
| 0.8298611111111112 | 0 |
| 0.8305555555555556 | 0 |
| 0.8312499999999999 | 0 |
| 0.8319444444444444 | 0 |
| 0.8326388888888889 | 0 |
| 0.8333333333333334 | 0 |
| 0.8340277777777777 | 0 |
| 0.8347222222222223 | 0 |
| 0.8354166666666667 | 0 |
| 0.8361111111111111 | 0 |
| 0.8368055555555555 | 0 |
| 0.8375 | 0 |
| 0.8381944444444445 | 0 |
| 0.8388888888888889 | 0 |
| 0.8395833333333332 | 0 |
| 0.8402777777777778 | 0 |
| 0.8409722222222222 | 0 |
| 0.8416666666666667 | 0 |
| 0.842361111111111 | 0 |
| 0.8430555555555556 | 0 |
| 0.84375 | 0 |
| 0.8444444444444444 | 0 |
| 0.845138888888889 | 0 |
| 0.8458333333333333 | 0 |
| 0.8465277777777778 | 0 |
| 0.8472222222222222 | 0 |
| 0.8479166666666668 | 0 |
| 0.8486111111111111 | 0 |
| 0.8493055555555555 | 0 |
| 0.85 | 0 |
| 0.8506944444444445 | 0 |
| 0.8513888888888889 | 0 |
| 0.8520833333333333 | 0 |
| 0.8527777777777777 | 0 |
| 0.8534722222222223 | 0 |
| 0.8541666666666666 | 0 |
| 0.8548611111111111 | 0 |
| 0.8555555555555556 | 0 |
| 0.8562500000000001 | 0 |
| 0.8569444444444444 | 0 |
| 0.8576388888888888 | 0 |
| 0.8583333333333334 | 0 |
| 0.8590277777777778 | 0 |
| 0.8597222222222222 | 0 |
| 0.8604166666666666 | 0 |
| 0.8611111111111112 | 0 |
| 0.8618055555555556 | 0 |
| 0.8624999999999999 | 0 |
| 0.8631944444444444 | 0 |
| 0.8638888888888889 | 0 |
| 0.8645833333333334 | 0 |
| 0.8652777777777777 | 0 |
| 0.8659722222222223 | 0 |
| 0.8666666666666667 | 0 |
| 0.8673611111111111 | 0 |
| 0.8680555555555555 | 0 |
| 0.86875 | 0 |
| 0.8694444444444445 | 0 |
| 0.8701388888888889 | 0 |
| 0.8708333333333332 | 0 |
| 0.8715277777777778 | 0 |
| 0.8722222222222222 | 0 |
| 0.8729166666666667 | 0 |
| 0.873611111111111 | 0 |
| 0.8743055555555556 | 0 |
| 0.875 | 0 |
| 0.8756944444444444 | 0 |
| 0.876388888888889 | 0 |
| 0.8770833333333333 | 0 |
| 0.8777777777777778 | 0 |
| 0.8784722222222222 | 0 |
| 0.8791666666666668 | 0 |
| 0.8798611111111111 | 0 |
| 0.8805555555555555 | 0 |
| 0.88125 | 0 |
| 0.8819444444444445 | 0 |
| 0.8826388888888889 | 0 |
| 0.8833333333333333 | 0 |
| 0.8840277777777777 | 0 |
| 0.8847222222222223 | 0 |
| 0.8854166666666666 | 0 |
| 0.8861111111111111 | 0 |
| 0.8868055555555556 | 0 |
| 0.8875000000000001 | 0 |
| 0.8881944444444444 | 0 |
| 0.8888888888888888 | 0 |
| 0.8895833333333334 | 0 |
| 0.8902777777777778 | 0 |
| 0.8909722222222222 | 0 |
| 0.8916666666666666 | 0 |
| 0.8923611111111112 | 0 |
| 0.8930555555555556 | 0 |
| 0.8937499999999999 | 0 |
| 0.8944444444444444 | 0 |
| 0.8951388888888889 | 0 |
| 0.8958333333333334 | 0 |
| 0.8965277777777777 | 0 |
| 0.8972222222222223 | 0 |
| 0.8979166666666667 | 0 |
| 0.8986111111111111 | 0 |
| 0.8993055555555555 | 0 |
| 0.9 | 0 |
| 0.9006944444444445 | 0 |
| 0.9013888888888889 | 0 |
| 0.9020833333333332 | 0 |
| 0.9027777777777778 | 0 |
| 0.9034722222222222 | 0 |
| 0.9041666666666667 | 0 |
| 0.904861111111111 | 0 |
| 0.9055555555555556 | 0 |
| 0.90625 | 0 |
| 0.9069444444444444 | 0 |
| 0.907638888888889 | 0 |
| 0.9083333333333333 | 0 |
| 0.9090277777777778 | 0 |
| 0.9097222222222222 | 0 |
| 0.9104166666666668 | 0 |
| 0.9111111111111111 | 0 |
| 0.9118055555555555 | 0 |
| 0.9125 | 0 |
| 0.9131944444444445 | 0 |
| 0.9138888888888889 | 0 |
| 0.9145833333333333 | 0 |
| 0.9152777777777777 | 0 |
| 0.9159722222222223 | 0 |
| 0.9166666666666666 | 0 |
| 0.9173611111111111 | 0 |
| 0.9180555555555556 | 0 |
| 0.9187500000000001 | 0 |
| 0.9194444444444444 | 0 |
| 0.9201388888888888 | 0 |
| 0.9208333333333334 | 0 |
| 0.9215277777777778 | 0 |
| 0.9222222222222222 | 0 |
| 0.9229166666666666 | 0 |
| 0.9236111111111112 | 0 |
| 0.9243055555555556 | 0 |
| 0.9249999999999999 | 0 |
| 0.9256944444444444 | 0 |
| 0.9263888888888889 | 0 |
| 0.9270833333333334 | 0 |
| 0.9277777777777777 | 0 |
| 0.9284722222222223 | 0 |
| 0.9291666666666667 | 0 |
| 0.9298611111111111 | 0 |
| 0.9305555555555555 | 0 |
| 0.93125 | 0 |
| 0.9319444444444445 | 0 |
| 0.9326388888888889 | 0 |
| 0.9333333333333332 | 0 |
| 0.9340277777777778 | 0 |
| 0.9347222222222222 | 0 |
| 0.9354166666666667 | 0 |
| 0.936111111111111 | 0 |
| 0.9368055555555556 | 0 |
| 0.9375 | 0 |
| 0.9381944444444444 | 0 |
| 0.938888888888889 | 0 |
| 0.9395833333333333 | 0 |
| 0.9402777777777778 | 0 |
| 0.9409722222222222 | 0 |
| 0.9416666666666668 | 0 |
| 0.9423611111111111 | 0 |
| 0.9430555555555555 | 0 |
| 0.94375 | 0 |
| 0.9444444444444445 | 0 |
| 0.9451388888888889 | 0 |
| 0.9458333333333333 | 0 |
| 0.9465277777777777 | 0 |
| 0.9472222222222223 | 0 |
| 0.9479166666666666 | 0 |
| 0.9486111111111111 | 0 |
| 0.9493055555555556 | 0 |
| 0.9500000000000001 | 0 |
| 0.9506944444444444 | 0 |
| 0.9513888888888888 | 0 |
| 0.9520833333333334 | 0 |
| 0.9527777777777778 | 0 |
| 0.9534722222222222 | 0 |
| 0.9541666666666666 | 0 |
| 0.9548611111111112 | 0 |
| 0.9555555555555556 | 0 |
| 0.9562499999999999 | 0 |
| 0.9569444444444444 | 0 |
| 0.9576388888888889 | 0 |
| 0.9583333333333334 | 0 |
| 0.9590277777777777 | 0 |
| 0.9597222222222223 | 0 |
| 0.9604166666666667 | 0 |
| 0.9611111111111111 | 0 |
| 0.9618055555555555 | 0 |
| 0.9625 | 0 |
| 0.9631944444444445 | 0 |
| 0.9638888888888889 | 0 |
| 0.9645833333333332 | 0 |
| 0.9652777777777778 | 0 |
| 0.9659722222222222 | 0 |
| 0.9666666666666667 | 0 |
| 0.967361111111111 | 0 |
| 0.9680555555555556 | 0 |
| 0.96875 | 0 |
| 0.9694444444444444 | 0 |
| 0.970138888888889 | 0 |
| 0.9708333333333333 | 0 |
| 0.9715277777777778 | 0 |
| 0.9722222222222222 | 0 |
| 0.9729166666666668 | 0 |
| 0.9736111111111111 | 0 |
| 0.9743055555555555 | 0 |
| 0.975 | 0 |
| 0.9756944444444445 | 0 |
| 0.9763888888888889 | 0 |
| 0.9770833333333333 | 0 |
| 0.9777777777777777 | 0 |
| 0.9784722222222223 | 0 |
| 0.9791666666666666 | 0 |
| 0.9798611111111111 | 0 |
| 0.9805555555555556 | 0 |
| 0.9812500000000001 | 0 |
| 0.9819444444444444 | 0 |
| 0.9826388888888888 | 0 |
| 0.9833333333333334 | 0 |
| 0.9840277777777778 | 0 |
| 0.9847222222222222 | 0 |
| 0.9854166666666666 | 0 |
| 0.9861111111111112 | 0 |
| 0.9868055555555556 | 0 |
| 0.9874999999999999 | 0 |
| 0.9881944444444444 | 0 |
| 0.9888888888888889 | 0 |
| 0.9895833333333334 | 0 |
| 0.9902777777777777 | 0 |
| 0.9909722222222223 | 0 |
| 0.9916666666666667 | 0 |
| 0.9923611111111111 | 0 |
| 0.9930555555555555 | 0 |
| 0.99375 | 0 |
| 0.9944444444444445 | 0 |
| 0.9951388888888889 | 0 |
| 0.9958333333333332 | 0 |
| 0.9965277777777778 | 0 |
| 0.9972222222222222 | 0 |
| 0.9979166666666667 | 0 |
| 0.998611111111111 | 0 |
| 0.9993055555555556 | 0 |